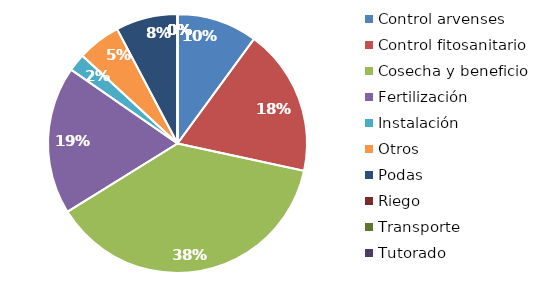
| Category | Valor |
|---|---|
| Control arvenses | 4550000 |
| Control fitosanitario | 8295000 |
| Cosecha y beneficio | 17092480 |
| Fertilización | 8365000 |
| Instalación | 995000 |
| Otros | 2450000 |
| Podas | 3500000 |
| Riego | 0 |
| Transporte | 0 |
| Tutorado | 0 |